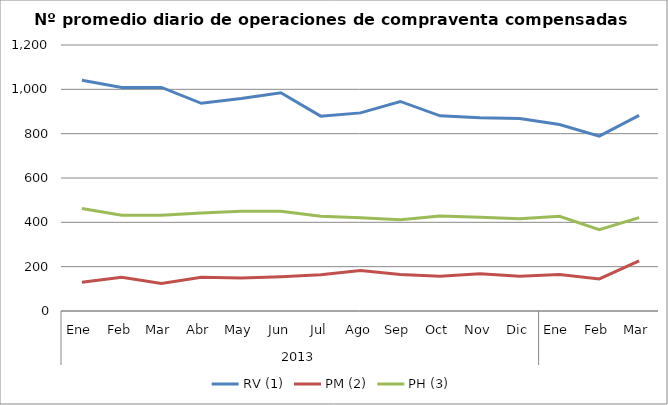
| Category | RV (1) | PM (2) | PH (3) |
|---|---|---|---|
| 0 | 1040.636 | 129.682 | 462.545 |
| 1 | 1008.7 | 152.35 | 432.05 |
| 2 | 1008.45 | 123.6 | 431.9 |
| 3 | 937.091 | 152.273 | 442.545 |
| 4 | 958.381 | 148.429 | 449.571 |
| 5 | 984.3 | 154.95 | 450 |
| 6 | 878.955 | 163.091 | 427.955 |
| 7 | 893.762 | 182.333 | 420.857 |
| 8 | 945.278 | 164.944 | 411.222 |
| 9 | 880.5 | 156.955 | 428.864 |
| 10 | 871.35 | 167.95 | 423.25 |
| 11 | 868.85 | 156.75 | 415.75 |
| 12 | 841.591 | 164.955 | 427.091 |
| 13 | 788.8 | 144.95 | 366.85 |
| 14 | 882.238 | 225.667 | 421.238 |